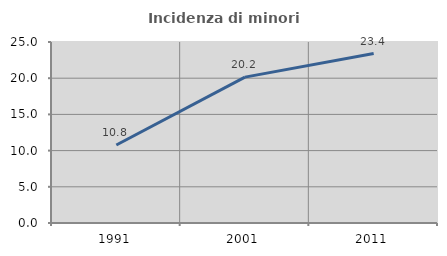
| Category | Incidenza di minori stranieri |
|---|---|
| 1991.0 | 10.769 |
| 2001.0 | 20.151 |
| 2011.0 | 23.41 |